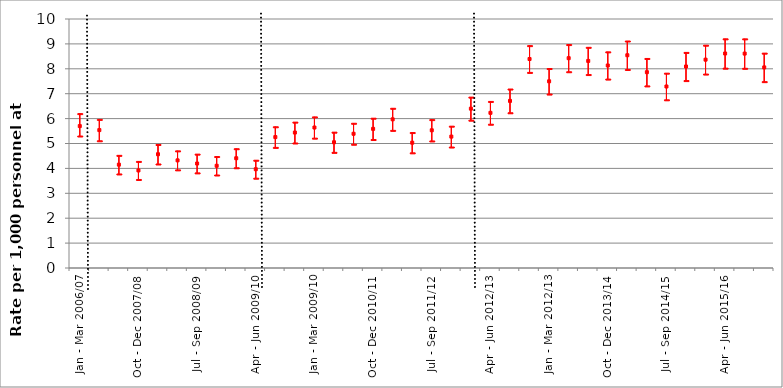
| Category | Rate of patients assessed with a mental disorder | 95% LL | 95% UL |
|---|---|---|---|
| Jan - Mar 2006/07 | 5.7 | 5.3 | 6.2 |
| Apr - Jun 2007/08 | 5.538 | 5.11 | 5.967 |
| Jul - Sep 2007/08 | 4.15 | 3.777 | 4.524 |
| Oct - Dec 2007/08 | 3.918 | 3.555 | 4.28 |
| Jan - Mar 2007/08 | 4.569 | 4.177 | 4.961 |
| Apr - Jun 2008/09 | 4.323 | 3.941 | 4.704 |
| Jul - Sep 2008/09 | 4.196 | 3.82 | 4.573 |
| Oct - Dec 2008/09 | 4.106 | 3.735 | 4.476 |
| Jan - Mar 2008/09 | 4.408 | 4.025 | 4.79 |
| Apr - Jun 2009/10 | 3.967 | 3.606 | 4.328 |
| Jul - Sep 2009/10 | 5.258 | 4.844 | 5.672 |
| Oct - Dec 2009/10 | 5.439 | 5.021 | 5.858 |
| Jan - Mar 2009/10 | 5.642 | 5.215 | 6.068 |
| Apr - Jun 2010/11 | 5.05 | 4.645 | 5.455 |
| Jul - Sep 2010/11 | 5.391 | 4.97 | 5.812 |
| Oct - Dec 2010/11 | 5.588 | 5.159 | 6.016 |
| Jan - Mar 2010/11 | 5.971 | 5.528 | 6.414 |
| Apr - Jun 2011/12 | 5.032 | 4.625 | 5.439 |
| Jul - Sep 2011/12 | 5.531 | 5.102 | 5.959 |
| Oct - Dec 2011/12 | 5.277 | 4.858 | 5.696 |
| Jan - Mar 2011/12 | 6.4 | 5.937 | 6.863 |
| Apr - Jun 2012/13 | 6.232 | 5.774 | 6.689 |
| Jul - Sep 2012/13 | 6.711 | 6.234 | 7.187 |
| Oct - Dec 2012/13 | 8.393 | 7.856 | 8.931 |
| Jan - Mar 2012/13 | 7.498 | 6.985 | 8.011 |
| Apr - Jun 2013/14 | 8.427 | 7.882 | 8.973 |
| Jul - Sep 2013/14 | 8.316 | 7.769 | 8.863 |
| Oct - Dec 2013/14 | 8.134 | 7.587 | 8.68 |
| Jan - Mar 2013/14 | 8.545 | 7.973 | 9.116 |
| Apr - Jun 2014/15 | 7.864 | 7.313 | 8.415 |
| Jul - Sep 2014/15 | 7.29 | 6.755 | 7.824 |
| Oct - Dec 2014/15 | 8.093 | 7.527 | 8.658 |
| Jan - Mar 2014/15 | 8.368 | 7.788 | 8.947 |
| Apr - Jun 2015/16 | 8.615 | 8.026 | 9.204 |
| Jul - Sep 2015/16 | 8.611 | 8.02 | 9.202 |
| Oct - Dec 2015/16 | 8.056 | 7.484 | 8.628 |